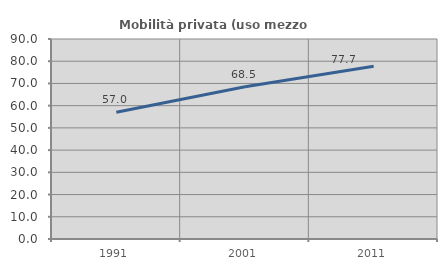
| Category | Mobilità privata (uso mezzo privato) |
|---|---|
| 1991.0 | 57.014 |
| 2001.0 | 68.503 |
| 2011.0 | 77.747 |